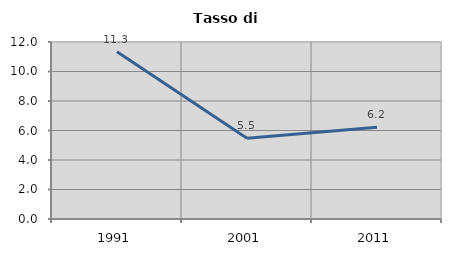
| Category | Tasso di disoccupazione   |
|---|---|
| 1991.0 | 11.335 |
| 2001.0 | 5.471 |
| 2011.0 | 6.222 |